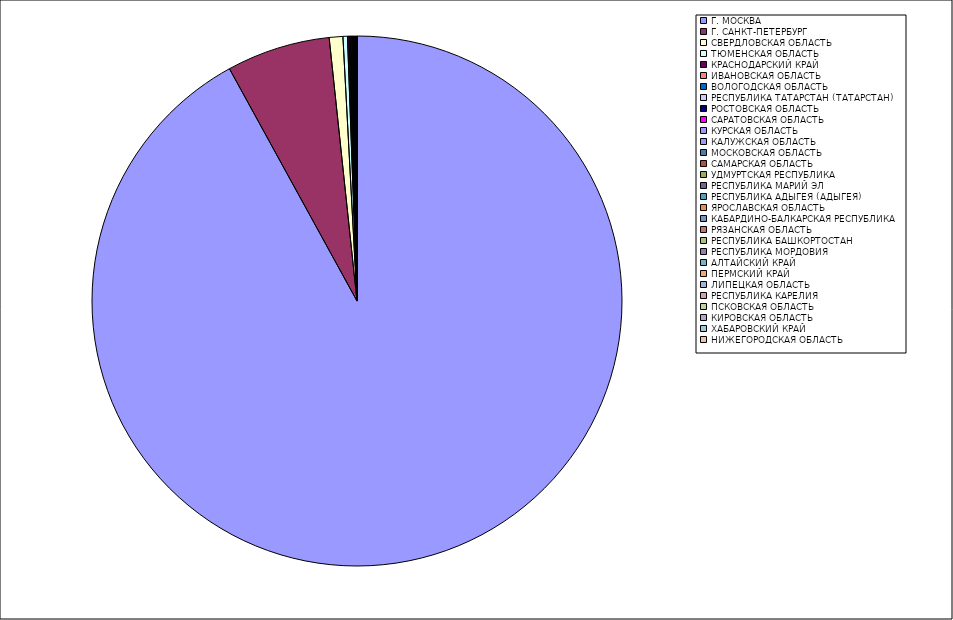
| Category | Оборот |
|---|---|
| Г. МОСКВА | 91.96 |
| Г. САНКТ-ПЕТЕРБУРГ | 6.312 |
| СВЕРДЛОВСКАЯ ОБЛАСТЬ | 0.83 |
| ТЮМЕНСКАЯ ОБЛАСТЬ | 0.274 |
| КРАСНОДАРСКИЙ КРАЙ | 0.094 |
| ИВАНОВСКАЯ ОБЛАСТЬ | 0.054 |
| ВОЛОГОДСКАЯ ОБЛАСТЬ | 0.052 |
| РЕСПУБЛИКА ТАТАРСТАН (ТАТАРСТАН) | 0.049 |
| РОСТОВСКАЯ ОБЛАСТЬ | 0.042 |
| САРАТОВСКАЯ ОБЛАСТЬ | 0.04 |
| КУРСКАЯ ОБЛАСТЬ | 0.036 |
| КАЛУЖСКАЯ ОБЛАСТЬ | 0.022 |
| МОСКОВСКАЯ ОБЛАСТЬ | 0.019 |
| САМАРСКАЯ ОБЛАСТЬ | 0.017 |
| УДМУРТСКАЯ РЕСПУБЛИКА | 0.015 |
| РЕСПУБЛИКА МАРИЙ ЭЛ | 0.014 |
| РЕСПУБЛИКА АДЫГЕЯ (АДЫГЕЯ) | 0.014 |
| ЯРОСЛАВСКАЯ ОБЛАСТЬ | 0.012 |
| КАБАРДИНО-БАЛКАРСКАЯ РЕСПУБЛИКА | 0.011 |
| РЯЗАНСКАЯ ОБЛАСТЬ | 0.01 |
| РЕСПУБЛИКА БАШКОРТОСТАН | 0.009 |
| РЕСПУБЛИКА МОРДОВИЯ | 0.008 |
| АЛТАЙСКИЙ КРАЙ | 0.008 |
| ПЕРМСКИЙ КРАЙ | 0.008 |
| ЛИПЕЦКАЯ ОБЛАСТЬ | 0.007 |
| РЕСПУБЛИКА КАРЕЛИЯ | 0.007 |
| ПСКОВСКАЯ ОБЛАСТЬ | 0.007 |
| КИРОВСКАЯ ОБЛАСТЬ | 0.007 |
| ХАБАРОВСКИЙ КРАЙ | 0.006 |
| НИЖЕГОРОДСКАЯ ОБЛАСТЬ | 0.005 |